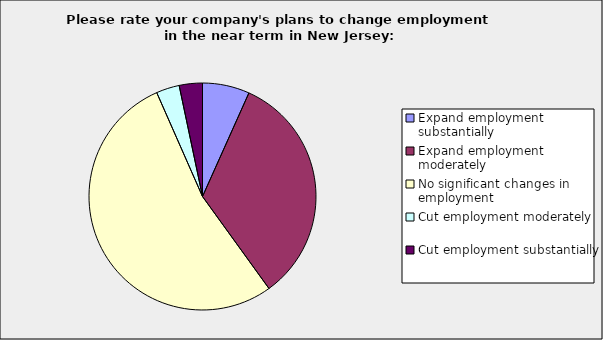
| Category | Series 0 |
|---|---|
| Expand employment substantially | 0.067 |
| Expand employment moderately | 0.333 |
| No significant changes in employment | 0.533 |
| Cut employment moderately | 0.033 |
| Cut employment substantially | 0.033 |